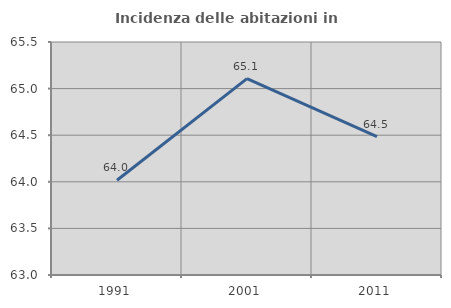
| Category | Incidenza delle abitazioni in proprietà  |
|---|---|
| 1991.0 | 64.017 |
| 2001.0 | 65.107 |
| 2011.0 | 64.485 |